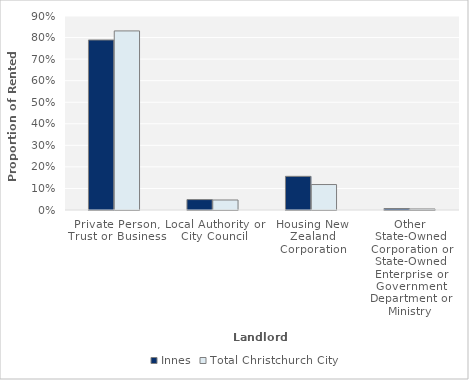
| Category | Innes | Total Christchurch City |
|---|---|---|
| Private Person, Trust or Business | 0.789 | 0.831 |
| Local Authority or City Council | 0.048 | 0.046 |
| Housing New Zealand Corporation | 0.156 | 0.118 |
| Other State-Owned Corporation or State-Owned Enterprise or Government Department or Ministry | 0.007 | 0.005 |